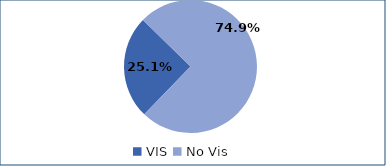
| Category | Series 0 |
|---|---|
| VIS | 0.251 |
| No Vis | 0.749 |